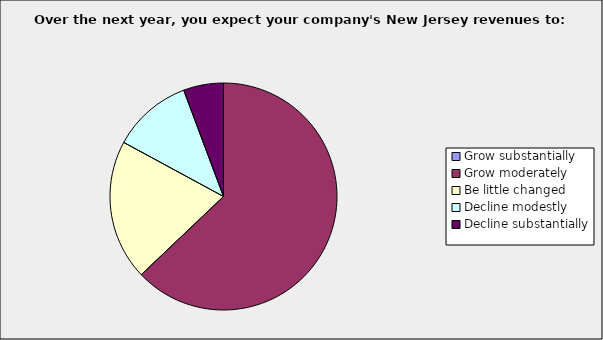
| Category | Series 0 |
|---|---|
| Grow substantially | 0 |
| Grow moderately | 0.629 |
| Be little changed | 0.2 |
| Decline modestly | 0.114 |
| Decline substantially | 0.057 |